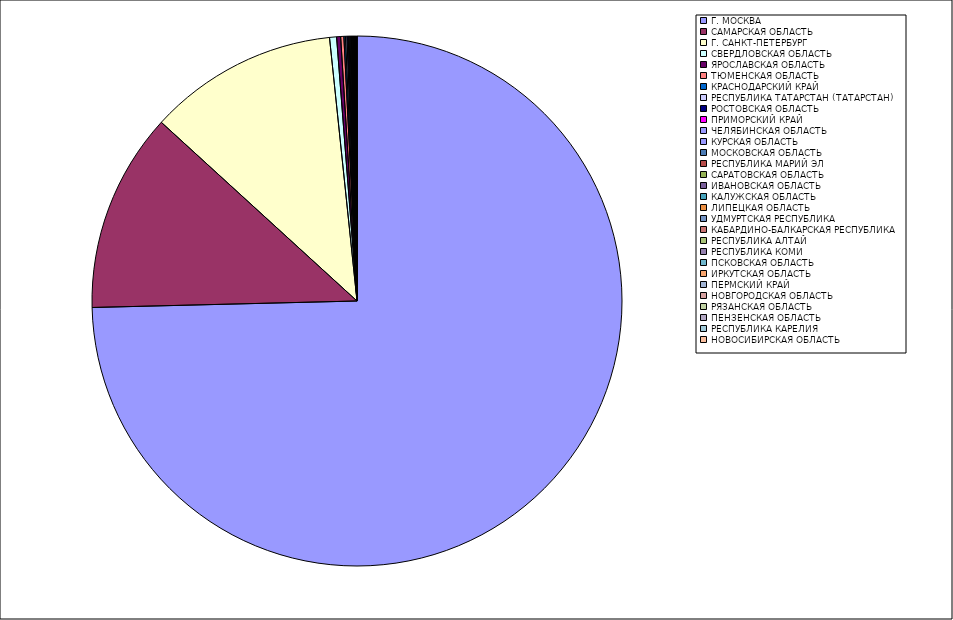
| Category | Оборот |
|---|---|
| Г. МОСКВА | 74.566 |
| САМАРСКАЯ ОБЛАСТЬ | 12.162 |
| Г. САНКТ-ПЕТЕРБУРГ | 11.559 |
| СВЕРДЛОВСКАЯ ОБЛАСТЬ | 0.427 |
| ЯРОСЛАВСКАЯ ОБЛАСТЬ | 0.245 |
| ТЮМЕНСКАЯ ОБЛАСТЬ | 0.194 |
| КРАСНОДАРСКИЙ КРАЙ | 0.094 |
| РЕСПУБЛИКА ТАТАРСТАН (ТАТАРСТАН) | 0.088 |
| РОСТОВСКАЯ ОБЛАСТЬ | 0.076 |
| ПРИМОРСКИЙ КРАЙ | 0.054 |
| ЧЕЛЯБИНСКАЯ ОБЛАСТЬ | 0.053 |
| КУРСКАЯ ОБЛАСТЬ | 0.048 |
| МОСКОВСКАЯ ОБЛАСТЬ | 0.041 |
| РЕСПУБЛИКА МАРИЙ ЭЛ | 0.039 |
| САРАТОВСКАЯ ОБЛАСТЬ | 0.035 |
| ИВАНОВСКАЯ ОБЛАСТЬ | 0.032 |
| КАЛУЖСКАЯ ОБЛАСТЬ | 0.03 |
| ЛИПЕЦКАЯ ОБЛАСТЬ | 0.028 |
| УДМУРТСКАЯ РЕСПУБЛИКА | 0.022 |
| КАБАРДИНО-БАЛКАРСКАЯ РЕСПУБЛИКА | 0.019 |
| РЕСПУБЛИКА АЛТАЙ | 0.018 |
| РЕСПУБЛИКА КОМИ | 0.018 |
| ПСКОВСКАЯ ОБЛАСТЬ | 0.016 |
| ИРКУТСКАЯ ОБЛАСТЬ | 0.015 |
| ПЕРМСКИЙ КРАЙ | 0.013 |
| НОВГОРОДСКАЯ ОБЛАСТЬ | 0.013 |
| РЯЗАНСКАЯ ОБЛАСТЬ | 0.012 |
| ПЕНЗЕНСКАЯ ОБЛАСТЬ | 0.01 |
| РЕСПУБЛИКА КАРЕЛИЯ | 0.008 |
| НОВОСИБИРСКАЯ ОБЛАСТЬ | 0.007 |